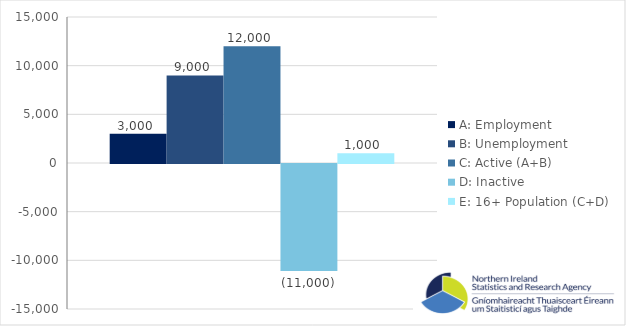
| Category | A: Employment | B: Unemployment | C: Active (A+B) | D: Inactive | E: 16+ Population (C+D) |
|---|---|---|---|---|---|
| 0 | 3000 | 9000 | 12000 | -11000 | 1000 |